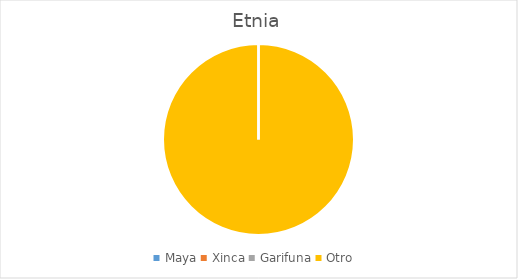
| Category | Series 0 |
|---|---|
| Maya | 0 |
| Xinca | 0 |
| Garifuna | 0 |
| Otro | 86 |